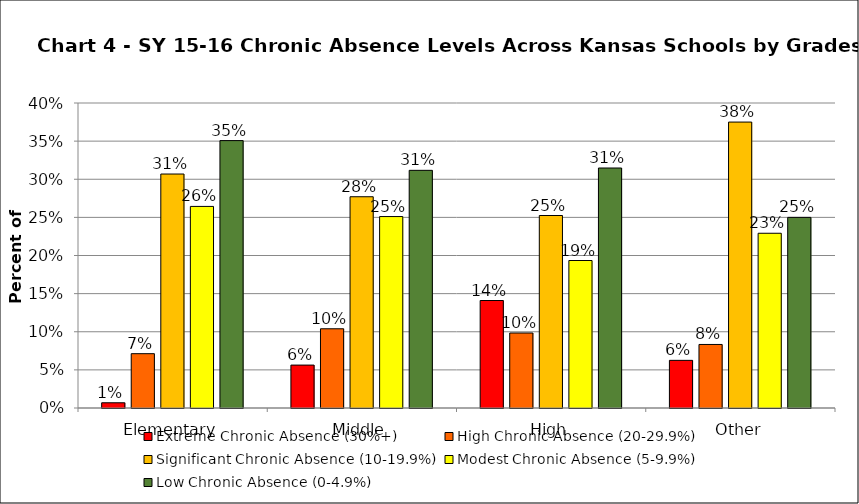
| Category | Extreme Chronic Absence (30%+) | High Chronic Absence (20-29.9%) | Significant Chronic Absence (10-19.9%) | Modest Chronic Absence (5-9.9%) | Low Chronic Absence (0-4.9%) |
|---|---|---|---|---|---|
| 0 | 0.007 | 0.071 | 0.307 | 0.264 | 0.351 |
| 1 | 0.056 | 0.104 | 0.277 | 0.251 | 0.312 |
| 2 | 0.141 | 0.098 | 0.252 | 0.193 | 0.315 |
| 3 | 0.062 | 0.083 | 0.375 | 0.229 | 0.25 |